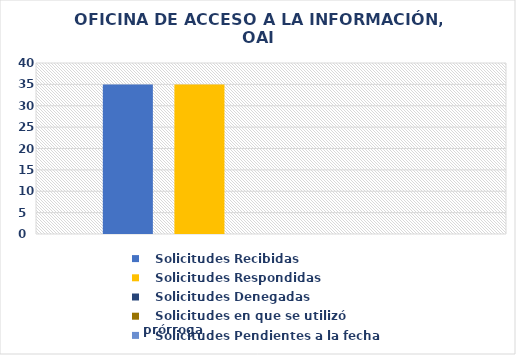
| Category |    Solicitudes Recibidas |    Solicitudes Respondidas |    Solicitudes Denegadas |    Solicitudes en que se utilizó prórroga |    Solicitudes Pendientes a la fecha |
|---|---|---|---|---|---|
| 0 | 35 | 35 | 0 | 0 | 0 |